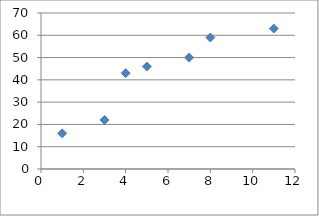
| Category | y |
|---|---|
| 1.0 | 16 |
| 7.0 | 50 |
| 3.0 | 22 |
| 8.0 | 59 |
| 11.0 | 63 |
| 5.0 | 46 |
| 4.0 | 43 |